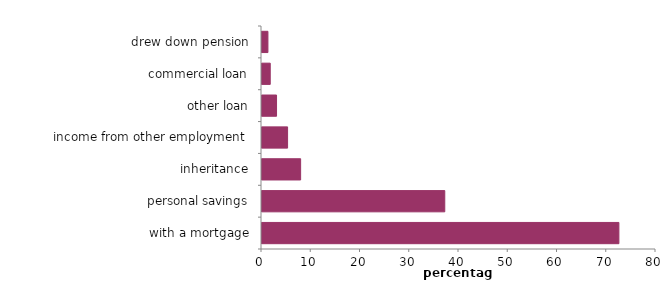
| Category | first property |
|---|---|
| with a mortgage | 72.465 |
| personal savings | 37.112 |
| inheritance | 7.845 |
| income from other employment  | 5.196 |
| other loan | 2.951 |
| commercial loan | 1.674 |
| drew down pension | 1.203 |